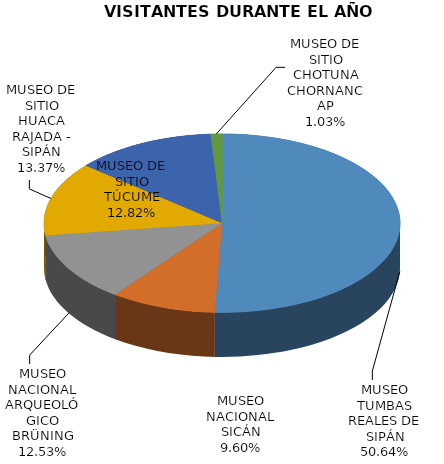
| Category | mUSEOS |
|---|---|
| MUSEO TUMBAS REALES DE SIPÁN | 149755 |
| MUSEO NACIONAL SICÁN | 28388 |
| MUSEO NACIONAL ARQUEOLÓGICO BRÜNING | 37055 |
| MUSEO DE SITIO HUACA RAJADA - SIPÁN | 39534 |
| MUSEO DE SITIO TÚCUME | 37921 |
| MUSEO DE SITIO CHOTUNA CHORNANCAP | 3053 |